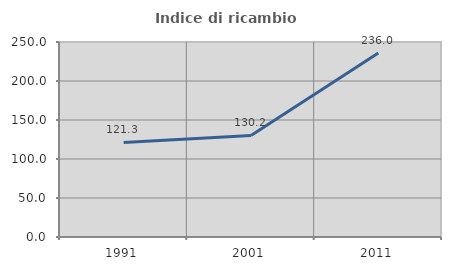
| Category | Indice di ricambio occupazionale  |
|---|---|
| 1991.0 | 121.304 |
| 2001.0 | 130.189 |
| 2011.0 | 236.039 |